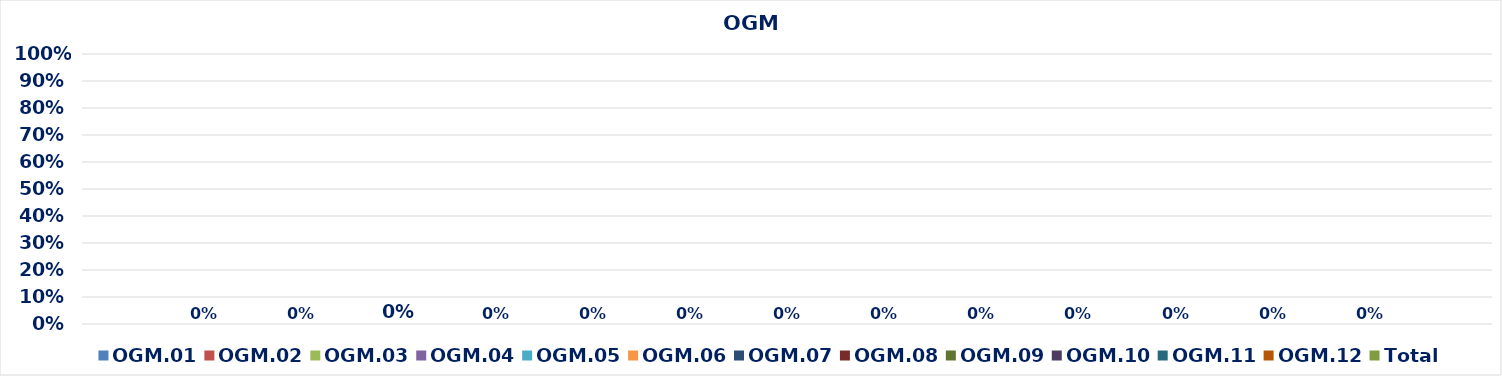
| Category | OGM.01 | OGM.02 | OGM.03 | OGM.04 | OGM.05 | OGM.06 | OGM.07 | OGM.08 | OGM.09 | OGM.10 | OGM.11 | OGM.12 | Total |
|---|---|---|---|---|---|---|---|---|---|---|---|---|---|
| 0 | 0 | 0 | 0 | 0 | 0 | 0 | 0 | 0 | 0 | 0 | 0 | 0 | 0 |